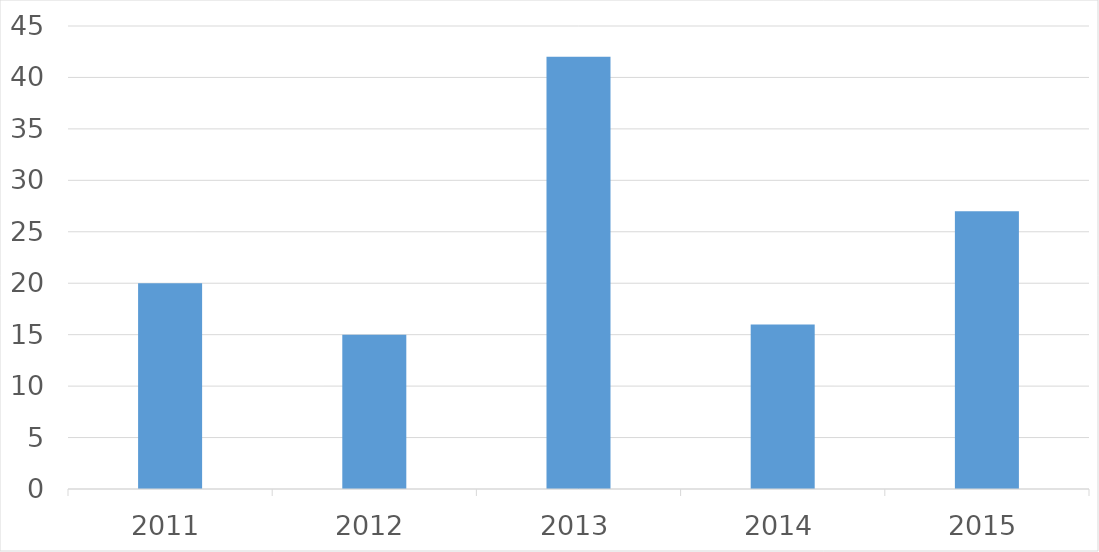
| Category | Series 0 |
|---|---|
| 2011 | 20 |
| 2012 | 15 |
| 2013 | 42 |
| 2014 | 16 |
| 2015 | 27 |